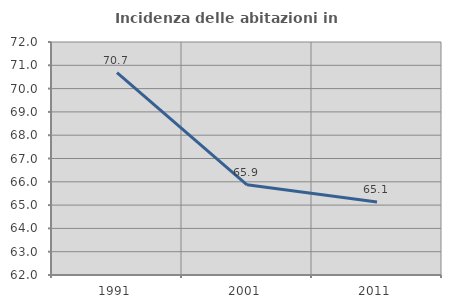
| Category | Incidenza delle abitazioni in proprietà  |
|---|---|
| 1991.0 | 70.689 |
| 2001.0 | 65.871 |
| 2011.0 | 65.137 |